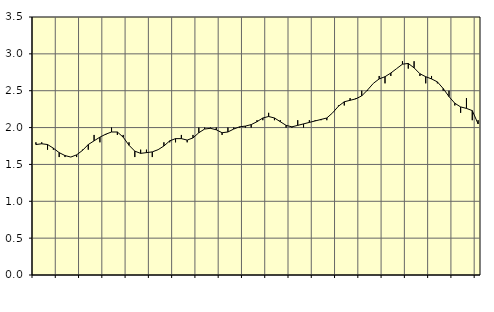
| Category | Piggar | Series 1 |
|---|---|---|
| nan | 1.8 | 1.77 |
| 1.0 | 1.8 | 1.78 |
| 1.0 | 1.7 | 1.77 |
| 1.0 | 1.7 | 1.72 |
| nan | 1.6 | 1.66 |
| 2.0 | 1.6 | 1.62 |
| 2.0 | 1.6 | 1.6 |
| 2.0 | 1.6 | 1.63 |
| nan | 1.7 | 1.69 |
| 3.0 | 1.7 | 1.77 |
| 3.0 | 1.9 | 1.82 |
| 3.0 | 1.8 | 1.87 |
| nan | 1.9 | 1.91 |
| 4.0 | 2 | 1.94 |
| 4.0 | 1.9 | 1.94 |
| 4.0 | 1.9 | 1.87 |
| nan | 1.8 | 1.76 |
| 5.0 | 1.6 | 1.68 |
| 5.0 | 1.7 | 1.65 |
| 5.0 | 1.7 | 1.66 |
| nan | 1.6 | 1.67 |
| 6.0 | 1.7 | 1.7 |
| 6.0 | 1.8 | 1.75 |
| 6.0 | 1.8 | 1.82 |
| nan | 1.8 | 1.85 |
| 7.0 | 1.9 | 1.85 |
| 7.0 | 1.8 | 1.83 |
| 7.0 | 1.9 | 1.86 |
| nan | 2 | 1.93 |
| 8.0 | 2 | 1.98 |
| 8.0 | 2 | 1.99 |
| 8.0 | 2 | 1.97 |
| nan | 1.9 | 1.93 |
| 9.0 | 2 | 1.94 |
| 9.0 | 2 | 1.98 |
| 9.0 | 2 | 2.01 |
| nan | 2 | 2.02 |
| 10.0 | 2 | 2.04 |
| 10.0 | 2.1 | 2.08 |
| 10.0 | 2.1 | 2.13 |
| nan | 2.2 | 2.15 |
| 11.0 | 2.1 | 2.13 |
| 11.0 | 2.1 | 2.08 |
| 11.0 | 2 | 2.03 |
| nan | 2 | 2.01 |
| 12.0 | 2.1 | 2.03 |
| 12.0 | 2 | 2.05 |
| 12.0 | 2.1 | 2.07 |
| nan | 2.1 | 2.09 |
| 13.0 | 2.1 | 2.11 |
| 13.0 | 2.1 | 2.13 |
| 13.0 | 2.2 | 2.2 |
| nan | 2.3 | 2.29 |
| 14.0 | 2.3 | 2.35 |
| 14.0 | 2.4 | 2.37 |
| 14.0 | 2.4 | 2.39 |
| nan | 2.5 | 2.43 |
| 15.0 | 2.5 | 2.51 |
| 15.0 | 2.6 | 2.6 |
| 15.0 | 2.7 | 2.66 |
| nan | 2.6 | 2.69 |
| 16.0 | 2.7 | 2.74 |
| 16.0 | 2.8 | 2.8 |
| 16.0 | 2.9 | 2.86 |
| nan | 2.8 | 2.87 |
| 17.0 | 2.9 | 2.81 |
| 17.0 | 2.7 | 2.73 |
| 17.0 | 2.6 | 2.69 |
| nan | 2.7 | 2.66 |
| 18.0 | 2.6 | 2.62 |
| 18.0 | 2.5 | 2.53 |
| 18.0 | 2.5 | 2.42 |
| nan | 2.3 | 2.33 |
| 19.0 | 2.2 | 2.28 |
| 19.0 | 2.4 | 2.26 |
| 19.0 | 2.1 | 2.23 |
| nan | 2.1 | 2.05 |